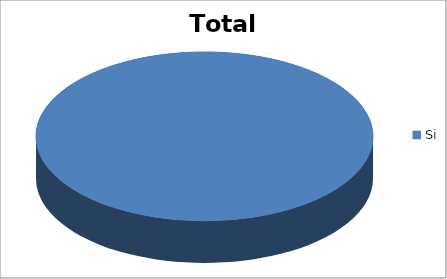
| Category | Total |
|---|---|
| Si | 1 |